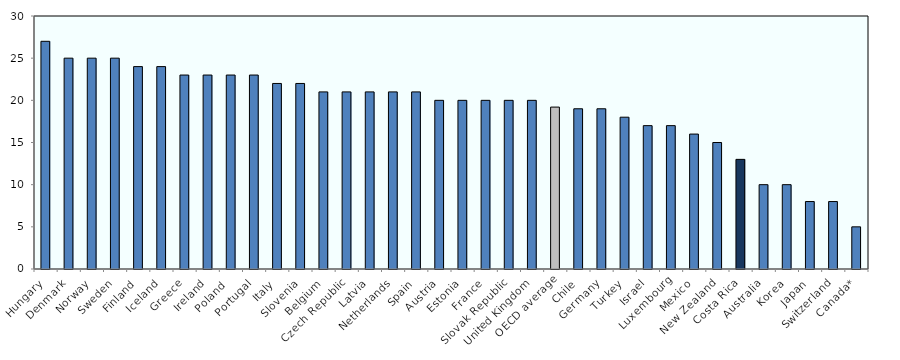
| Category | VAT/GST rates in 2016 |
|---|---|
| Hungary | 27 |
| Denmark | 25 |
| Norway | 25 |
| Sweden | 25 |
| Finland | 24 |
| Iceland | 24 |
| Greece | 23 |
| Ireland | 23 |
| Poland  | 23 |
| Portugal | 23 |
| Italy | 22 |
| Slovenia | 22 |
| Belgium | 21 |
| Czech Republic | 21 |
| Latvia | 21 |
| Netherlands | 21 |
| Spain | 21 |
| Austria | 20 |
| Estonia | 20 |
| France | 20 |
| Slovak Republic | 20 |
| United Kingdom | 20 |
| OECD average | 19.2 |
| Chile | 19 |
| Germany | 19 |
| Turkey | 18 |
| Israel | 17 |
| Luxembourg | 17 |
| Mexico | 16 |
| New Zealand | 15 |
| Costa Rica | 13 |
| Australia | 10 |
| Korea  | 10 |
| Japan | 8 |
| Switzerland | 8 |
| Canada* | 5 |